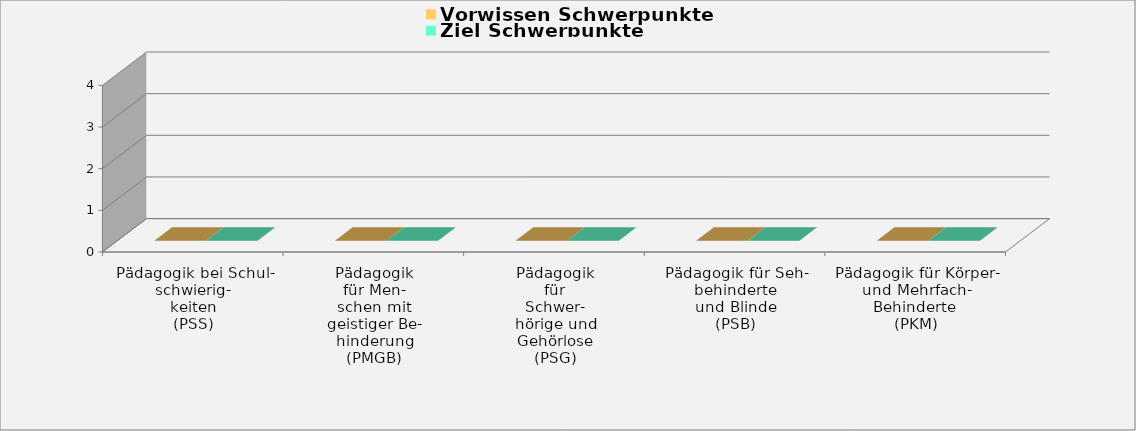
| Category | Vorwissen Schwerpunkte | Ziel Schwerpunkte |
|---|---|---|
| Pädagogik bei Schul-
schwierig-
keiten
(PSS) | 0 | 0 |
| Pädagogik
für Men-
schen mit
geistiger Be-
hinderung
(PMGB) | 0 | 0 |
| Pädagogik
für
Schwer-
hörige und
Gehörlose
(PSG) | 0 | 0 |
| Pädagogik für Seh-
behinderte
und Blinde
(PSB)
 | 0 | 0 |
| Pädagogik für Körper- und Mehrfach-
Behinderte 
(PKM) | 0 | 0 |